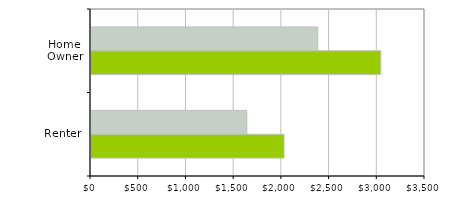
| Category | 2001 | 2010 |
|---|---|---|
| Home Owner | 2376 | 3037 |
| Renter | 1633 | 2023 |